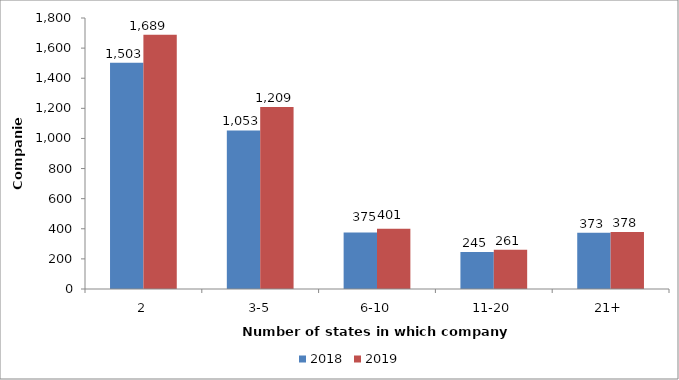
| Category | 2018 | 2019 |
|---|---|---|
| 2 | 1503 | 1689 |
| 3-5 | 1053 | 1209 |
| 6-10 | 375 | 401 |
| 11-20 | 245 | 261 |
| 21+ | 373 | 378 |